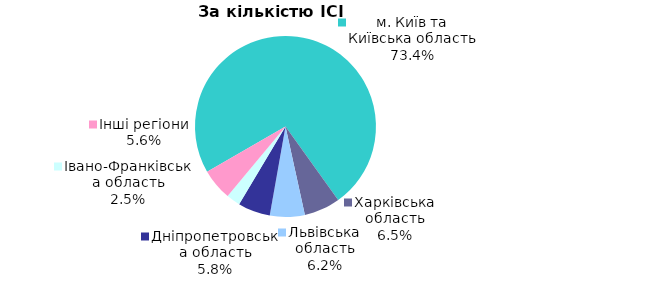
| Category | Series 0 |
|---|---|
| м. Київ та Київська область | 0.734 |
| Харківська область | 0.065 |
| Львівська область | 0.062 |
| Дніпропетровська область | 0.058 |
| Iвано-Франкiвська область | 0.025 |
| Інші регіони | 0.056 |